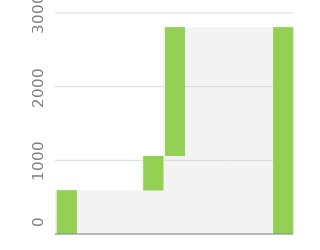
| Category | Series 2 |
|---|---|
| 0 | 592.5 |
| 1 | 592.5 |
| 2 | 592.5 |
| 3 | 592.5 |
| 4 | 1059.525 |
| 5 | 2806.754 |
| 6 | 2806.754 |
| 7 | 2806.754 |
| 8 | 2806.754 |
| 9 | 2806.754 |
| 10 | 2806.754 |